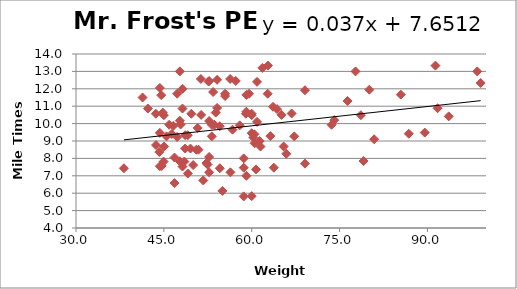
| Category | Series 0 |
|---|---|
| 55.45454545454545 | 11.717 |
| 59.54545454545454 | 11.717 |
| 69.09090909090908 | 11.917 |
| 77.72727272727272 | 13 |
| 55.45454545454545 | 11.583 |
| 44.54545454545454 | 11.633 |
| 60.90909090909091 | 12.4 |
| 59.090909090909086 | 11.65 |
| 54.54545454545454 | 9.85 |
| 51.36363636363636 | 10.5 |
| 42.272727272727266 | 10.867 |
| 62.72727272727272 | 11.717 |
| 47.272727272727266 | 11.717 |
| 63.18181818181818 | 9.283 |
| 91.36363636363636 | 13.333 |
| 54.090909090909086 | 10.9 |
| 52.72727272727272 | 10.15 |
| 49.090909090909086 | 9.333 |
| 99.09090909090908 | 12.333 |
| 44.99999999999999 | 10.483 |
| 59.99999999999999 | 10.483 |
| 49.090909090909086 | 7.133 |
| 74.09090909090908 | 10.2 |
| 61.81818181818181 | 13.2 |
| 52.63636363636363 | 12.417 |
| 65.45454545454545 | 8.683 |
| 64.31818181818181 | 10.833 |
| 44.31818181818181 | 9.467 |
| 78.63636363636363 | 10.483 |
| 41.36363636363636 | 11.5 |
| 52.72727272727272 | 7.2 |
| 58.63636363636363 | 8 |
| 47.72727272727273 | 7.833 |
| 59.99999999999999 | 10.567 |
| 54.090909090909086 | 12.517 |
| 63.63636363636363 | 10.967 |
| 60.90909090909091 | 10.1 |
| 45.90909090909091 | 9.933 |
| 47.86363636363636 | 9.95 |
| 53.63636363636363 | 9.933 |
| 69.09090909090908 | 7.7 |
| 93.63636363636363 | 10.417 |
| 47.272727272727266 | 9.233 |
| 53.18181818181818 | 9.933 |
| 60.272727272727266 | 9.2 |
| 43.63636363636363 | 10.567 |
| 86.81818181818181 | 9.417 |
| 65.9090909090909 | 8.267 |
| 56.31818181818181 | 12.567 |
| 50.90909090909091 | 8.5 |
| 63.77272727272727 | 7.467 |
| 53.40909090909091 | 11.817 |
| 91.72727272727272 | 10.883 |
| 53.86363636363636 | 10.633 |
| 98.49999999999999 | 13 |
| 43.663636363636364 | 8.767 |
| 60.49999999999999 | 8.867 |
| 48.5 | 7.817 |
| 48.18181818181818 | 7.533 |
| 89.54545454545453 | 9.483 |
| 59.090909090909086 | 7 |
| 44.31818181818181 | 7.55 |
| 85.45454545454545 | 11.667 |
| 46.81818181818181 | 6.583 |
| 59.0 | 10.567 |
| 44.31818181818181 | 12.05 |
| 51.31818181818182 | 12.567 |
| 56.72727272727272 | 9.65 |
| 60.72727272727272 | 7.367 |
| 61.5 | 8.683 |
| 50.54545454545454 | 8.5 |
| 50.77272727272727 | 9.75 |
| 44.95454545454545 | 7.817 |
| 44.63636363636363 | 7.567 |
| 80.08181818181818 | 11.95 |
| 65.09090909090908 | 10.5 |
| 44.22727272727272 | 8.367 |
| 59.090909090909086 | 10.683 |
| 44.81818181818181 | 10.633 |
| 51.72727272727272 | 6.733 |
| 52.45454545454545 | 7.65 |
| 49.68181818181818 | 10.567 |
| 62.772727272727266 | 13.333 |
| 45.04545454545454 | 8.683 |
| 46.590909090909086 | 9.867 |
| 57.95454545454545 | 9.9 |
| 58.63636363636363 | 5.817 |
| 56.36363636363636 | 7.2 |
| 79.09090909090908 | 7.85 |
| 48.18181818181818 | 10.867 |
| 49.54545454545454 | 8.567 |
| 76.36363636363636 | 11.3 |
| 46.36363636363636 | 9.4 |
| 54.99999999999999 | 6.133 |
| 46.81818181818181 | 8.05 |
| 47.72727272727273 | 13 |
| 48.63636363636363 | 8.567 |
| 52.72727272727272 | 8.083 |
| 38.18181818181818 | 7.433 |
| 67.27272727272727 | 9.267 |
| 60.454545454545446 | 9.383 |
| 49.99999999999999 | 7.617 |
| 53.18181818181818 | 9.267 |
| 52.72727272727272 | 12.45 |
| 48.63636363636363 | 9.333 |
| 54.54545454545454 | 7.433 |
| 45.45454545454545 | 9.267 |
| 47.72727272727273 | 10.167 |
| 73.63636363636363 | 9.933 |
| 58.63636363636363 | 7.467 |
| 52.272727272727266 | 7.733 |
| 57.272727272727266 | 12.45 |
| 66.81818181818181 | 10.583 |
| 61.36363636363636 | 9 |
| 59.99999999999999 | 5.833 |
| 80.9090909090909 | 9.1 |
| 59.99999999999999 | 9.45 |
| 48.18181818181818 | 12 |